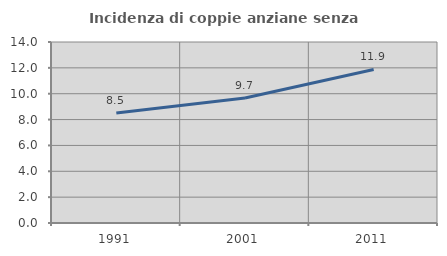
| Category | Incidenza di coppie anziane senza figli  |
|---|---|
| 1991.0 | 8.502 |
| 2001.0 | 9.663 |
| 2011.0 | 11.874 |